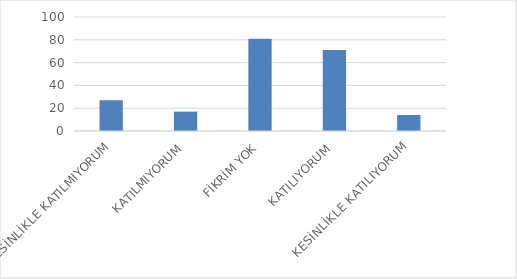
| Category | Series 0 |
|---|---|
| KESİNLİKLE KATILMIYORUM | 27 |
| KATILMIYORUM | 17 |
| FİKRİM YOK | 81 |
| KATILIYORUM | 71 |
| KESİNLİKLE KATILIYORUM | 14 |